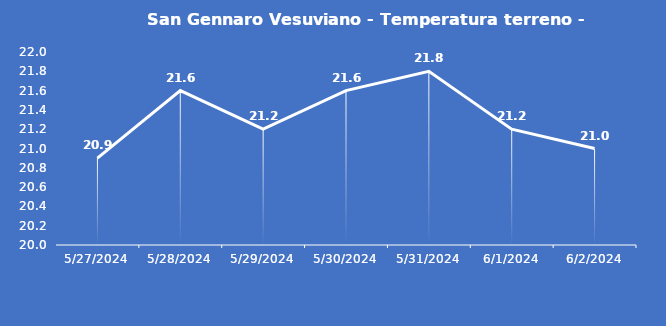
| Category | San Gennaro Vesuviano - Temperatura terreno - Grezzo (°C) |
|---|---|
| 5/27/24 | 20.9 |
| 5/28/24 | 21.6 |
| 5/29/24 | 21.2 |
| 5/30/24 | 21.6 |
| 5/31/24 | 21.8 |
| 6/1/24 | 21.2 |
| 6/2/24 | 21 |